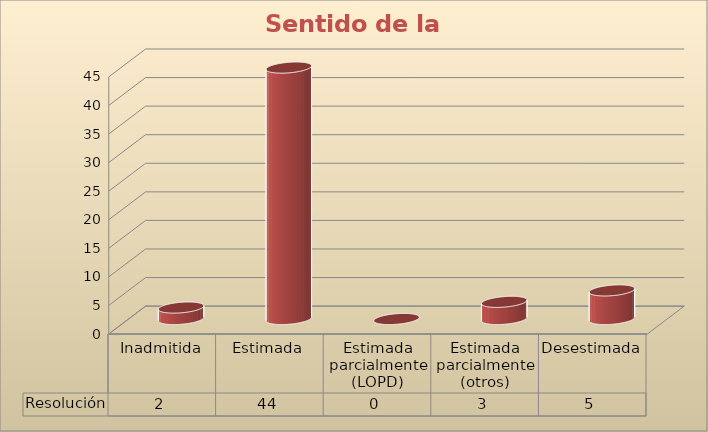
| Category | Resolución |
|---|---|
| Inadmitida | 2 |
| Estimada | 44 |
| Estimada parcialmente (LOPD) | 0 |
| Estimada parcialmente (otros) | 3 |
| Desestimada | 5 |